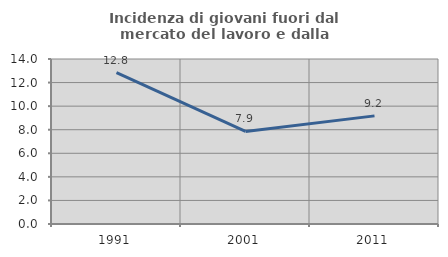
| Category | Incidenza di giovani fuori dal mercato del lavoro e dalla formazione  |
|---|---|
| 1991.0 | 12.834 |
| 2001.0 | 7.857 |
| 2011.0 | 9.174 |